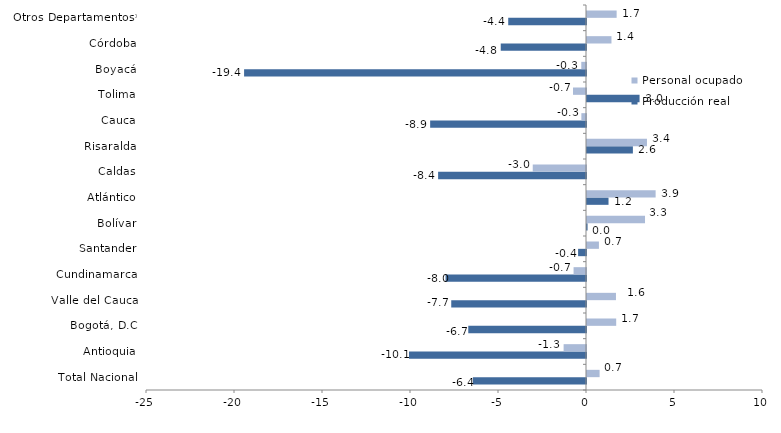
| Category | Producción real | Personal ocupado |
|---|---|---|
| Total Nacional | -6.428 | 0.716 |
| Antioquia | -10.057 | -1.272 |
| Bogotá, D.C | -6.689 | 1.659 |
| Valle del Cauca | -7.657 | 1.646 |
| Cundinamarca | -7.979 | -0.706 |
| Santander | -0.45 | 0.678 |
| Bolívar | 0.033 | 3.296 |
| Atlántico | 1.223 | 3.899 |
| Caldas | -8.403 | -3.025 |
| Risaralda | 2.607 | 3.407 |
| Cauca | -8.855 | -0.263 |
| Tolima | 2.986 | -0.738 |
| Boyacá | -19.427 | -0.268 |
| Córdoba | -4.844 | 1.39 |
| Otros Departamentos* | -4.419 | 1.684 |